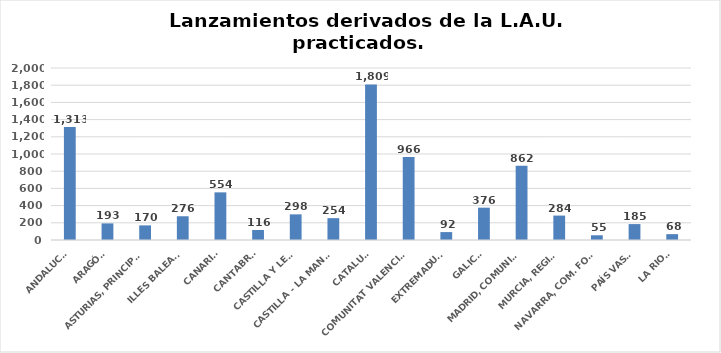
| Category | Series 0 |
|---|---|
| ANDALUCÍA | 1313 |
| ARAGÓN | 193 |
| ASTURIAS, PRINCIPADO | 170 |
| ILLES BALEARS | 276 |
| CANARIAS | 554 |
| CANTABRIA | 116 |
| CASTILLA Y LEÓN | 298 |
| CASTILLA - LA MANCHA | 254 |
| CATALUÑA | 1809 |
| COMUNITAT VALENCIANA | 966 |
| EXTREMADURA | 92 |
| GALICIA | 376 |
| MADRID, COMUNIDAD | 862 |
| MURCIA, REGIÓN | 284 |
| NAVARRA, COM. FORAL | 55 |
| PAÍS VASCO | 185 |
| LA RIOJA | 68 |